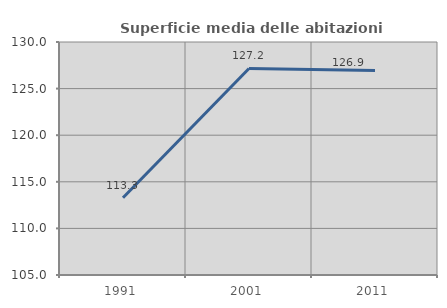
| Category | Superficie media delle abitazioni occupate |
|---|---|
| 1991.0 | 113.282 |
| 2001.0 | 127.164 |
| 2011.0 | 126.945 |